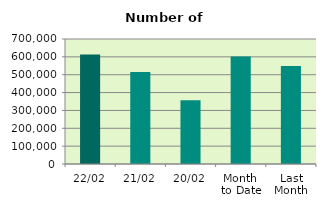
| Category | Series 0 |
|---|---|
| 22/02 | 613034 |
| 21/02 | 514906 |
| 20/02 | 357608 |
| Month 
to Date | 601770.5 |
| Last
Month | 549126.273 |